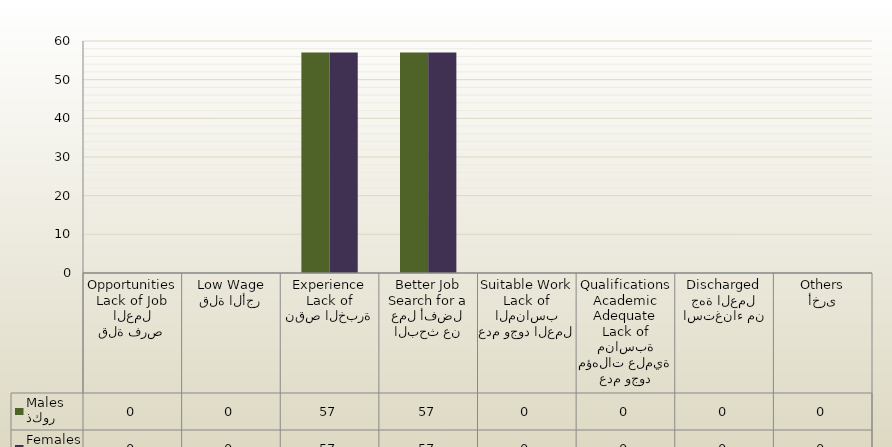
| Category | ذكور
Males | اناث
Females |
|---|---|---|
| قلة فرص العمل
Lack of Job Opportunities | 0 | 0 |
| قلة الأجر
Low Wage | 0 | 0 |
| نقص الخبرة
Lack of Experience | 57 | 57 |
| البحث عن عمل أفضل
Search for a Better Job | 57 | 57 |
| عدم وجود العمل المناسب
Lack of Suitable Work | 0 | 0 |
| عدم وجود مؤهلات علمية مناسبة
Lack of Adequate Academic Qualifications | 0 | 0 |
| استغناء من جهة العمل
Discharged | 0 | 0 |
| أخرى
Others | 0 | 0 |